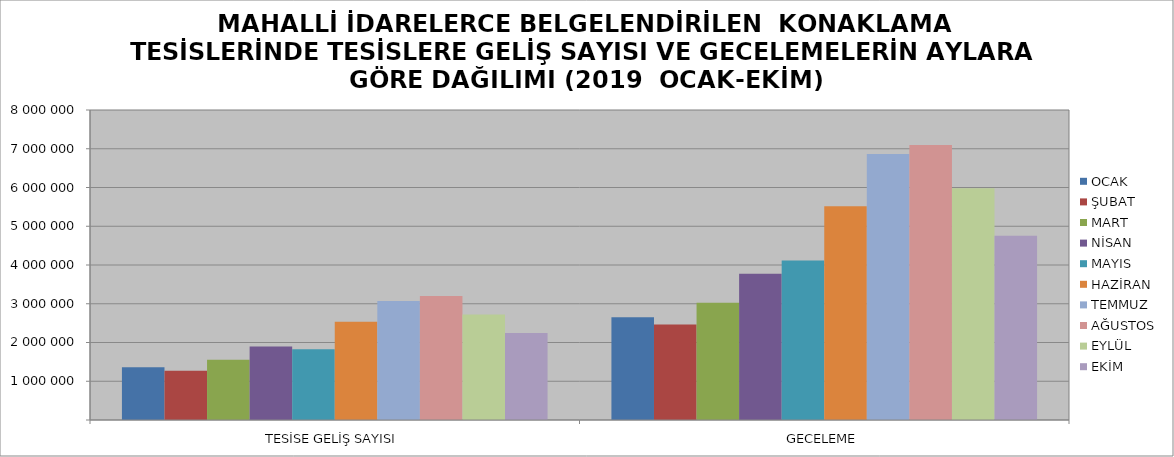
| Category | OCAK | ŞUBAT | MART | NİSAN | MAYIS | HAZİRAN | TEMMUZ | AĞUSTOS | EYLÜL | EKİM |
|---|---|---|---|---|---|---|---|---|---|---|
| TESİSE GELİŞ SAYISI | 1363187 | 1273727 | 1552518 | 1898202 | 1826154 | 2537491 | 3073499 | 3201724 | 2721047 | 2242115 |
| GECELEME | 2649437 | 2462023 | 3024704 | 3772615 | 4117532 | 5513568 | 6866550 | 7097153 | 5980815 | 4758060 |